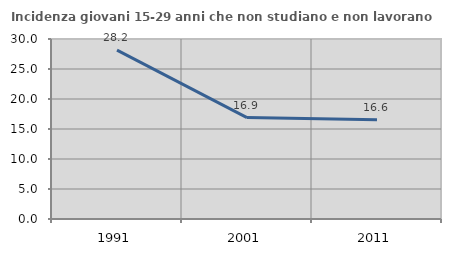
| Category | Incidenza giovani 15-29 anni che non studiano e non lavorano  |
|---|---|
| 1991.0 | 28.155 |
| 2001.0 | 16.901 |
| 2011.0 | 16.561 |